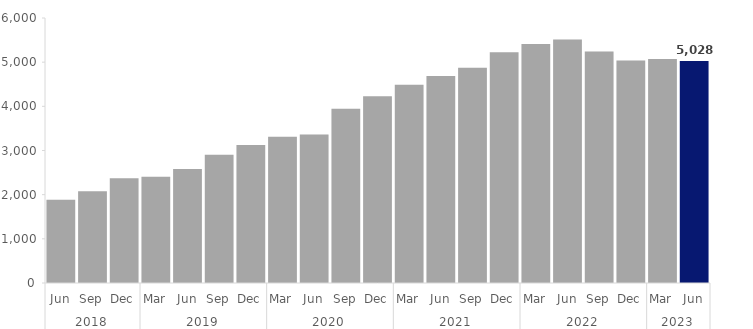
| Category | Series 0 |
|---|---|
| 0 | 1887 |
| 1 | 2076 |
| 2 | 2373 |
| 3 | 2406 |
| 4 | 2580 |
| 5 | 2901 |
| 6 | 3126 |
| 7 | 3312 |
| 8 | 3360 |
| 9 | 3948 |
| 10 | 4227 |
| 11 | 4488 |
| 12 | 4686 |
| 13 | 4875 |
| 14 | 5223 |
| 15 | 5409 |
| 16 | 5511 |
| 17 | 5241 |
| 18 | 5037 |
| 19 | 5073 |
| 20 | 5028 |